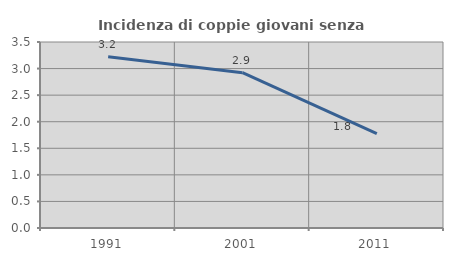
| Category | Incidenza di coppie giovani senza figli |
|---|---|
| 1991.0 | 3.22 |
| 2001.0 | 2.922 |
| 2011.0 | 1.776 |